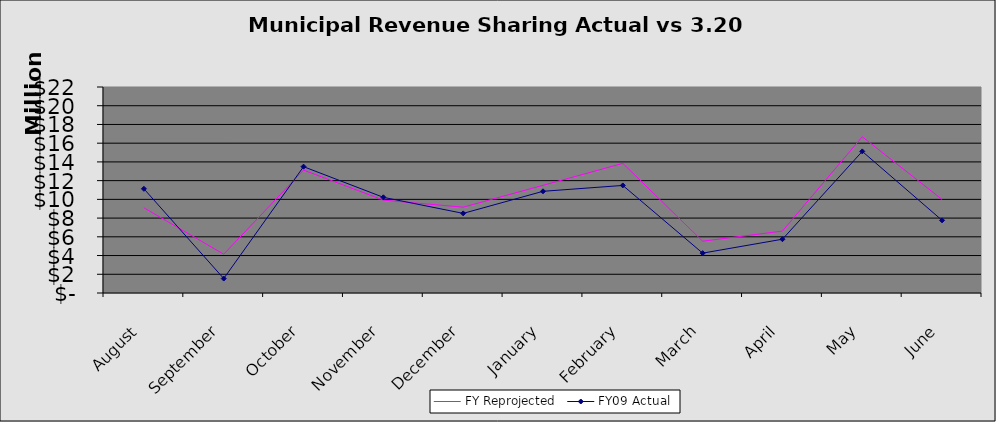
| Category | FY Reprojected | FY09 Actual |
|---|---|---|
| August | 9101974.662 | 11128399.99 |
| September | 4140937.475 | 1544000.08 |
| October | 13127009.628 | 13492900.02 |
| November | 9920335.419 | 10218099.87 |
| December | 9167537.022 | 8503222.36 |
| January | 11499602.857 | 10860099.91 |
| February | 13843469.702 | 11488499.93 |
| March | 5530852.14 | 4257000 |
| April | 6613058.739 | 5743660.7 |
| May | 16686050.605 | 15121999.91 |
| June | 9986220.441 | 7758287.89 |